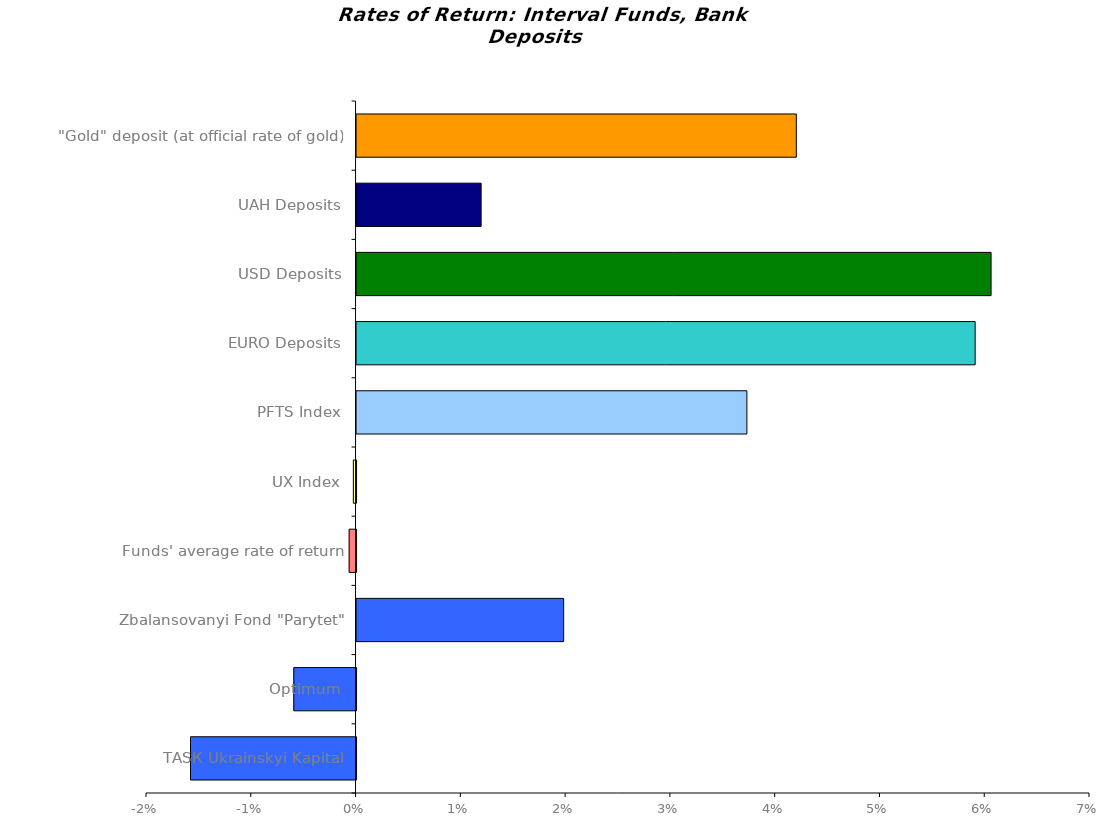
| Category | Series 0 |
|---|---|
| ТАSК Ukrainskyi Kapital | -0.016 |
| Optimum | -0.006 |
| Zbalansovanyi Fond "Parytet" | 0.02 |
| Funds' average rate of return | -0.001 |
| UX Index | 0 |
| PFTS Index | 0.037 |
| EURO Deposits | 0.059 |
| USD Deposits | 0.061 |
| UAH Deposits | 0.012 |
| "Gold" deposit (at official rate of gold) | 0.042 |